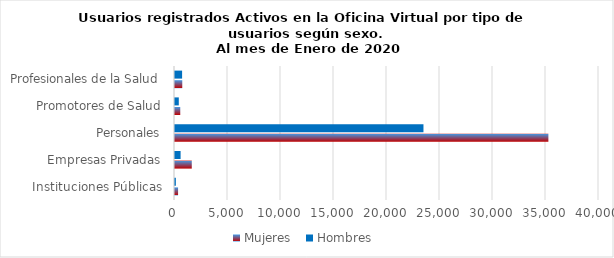
| Category | Mujeres | Hombres |
|---|---|---|
| Instituciones Públicas | 290 | 80 |
| Empresas Privadas | 1583 | 528 |
| Personales | 35225 | 23440 |
| Promotores de Salud | 496 | 358 |
| Profesionales de la Salud | 685 | 670 |